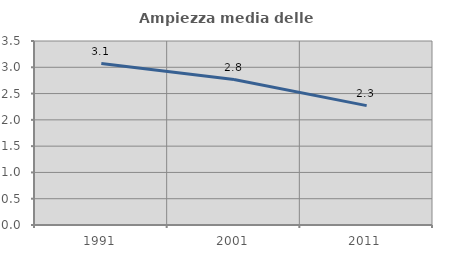
| Category | Ampiezza media delle famiglie |
|---|---|
| 1991.0 | 3.071 |
| 2001.0 | 2.767 |
| 2011.0 | 2.271 |